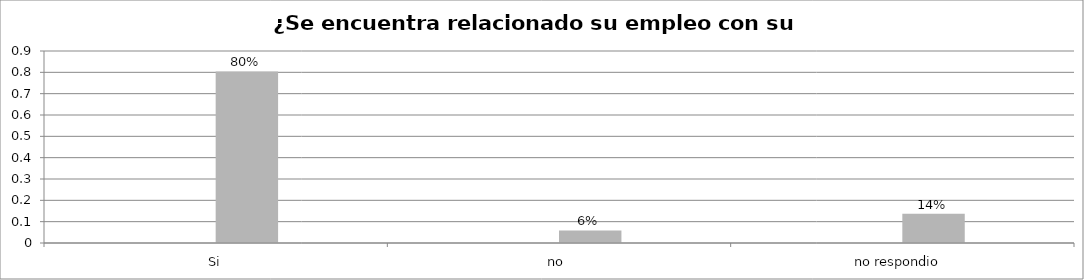
| Category | Series 0 | Series 1 | Series 2 | Series 3 |
|---|---|---|---|---|
| Si |  |  | 0.804 |  |
| no  |  |  | 0.059 |  |
| no respondio  |  |  | 0.137 |  |